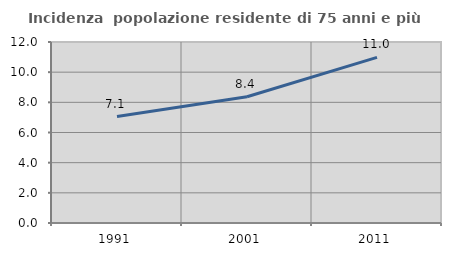
| Category | Incidenza  popolazione residente di 75 anni e più |
|---|---|
| 1991.0 | 7.054 |
| 2001.0 | 8.369 |
| 2011.0 | 10.977 |